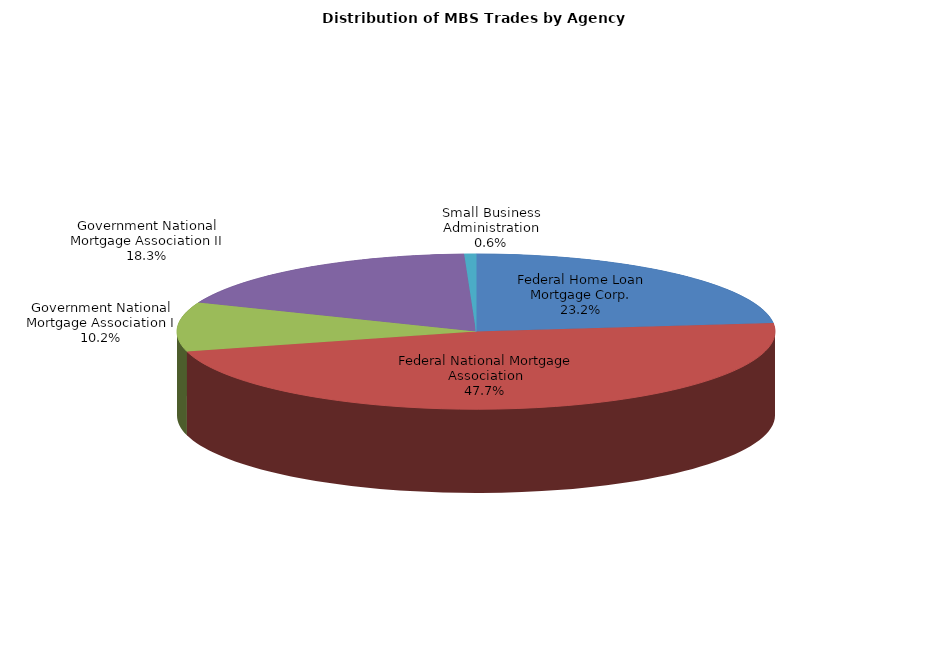
| Category | Series 0 |
|---|---|
| Federal Home Loan Mortgage Corp. | 724.329 |
| Federal National Mortgage Association | 1485.885 |
| Government National Mortgage Association I | 318.484 |
| Government National Mortgage Association II | 569.619 |
| Small Business Administration | 19.698 |